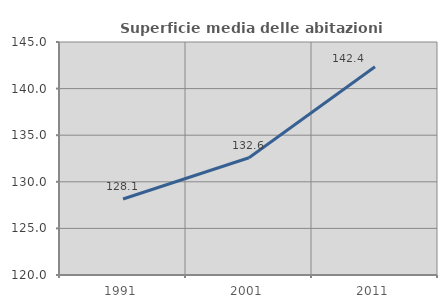
| Category | Superficie media delle abitazioni occupate |
|---|---|
| 1991.0 | 128.15 |
| 2001.0 | 132.576 |
| 2011.0 | 142.354 |